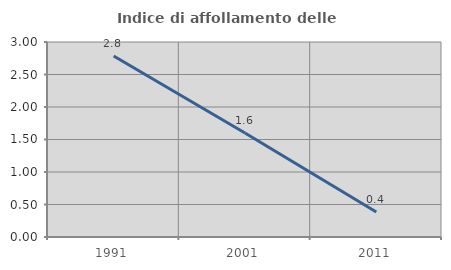
| Category | Indice di affollamento delle abitazioni  |
|---|---|
| 1991.0 | 2.785 |
| 2001.0 | 1.599 |
| 2011.0 | 0.385 |